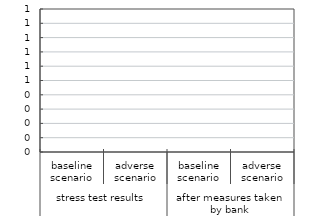
| Category | #REF! |
|---|---|
| 0 | 0 |
| 1900-01-01 | 0 |
| 1900-01-02 | 0 |
| 1900-01-03 | 0 |